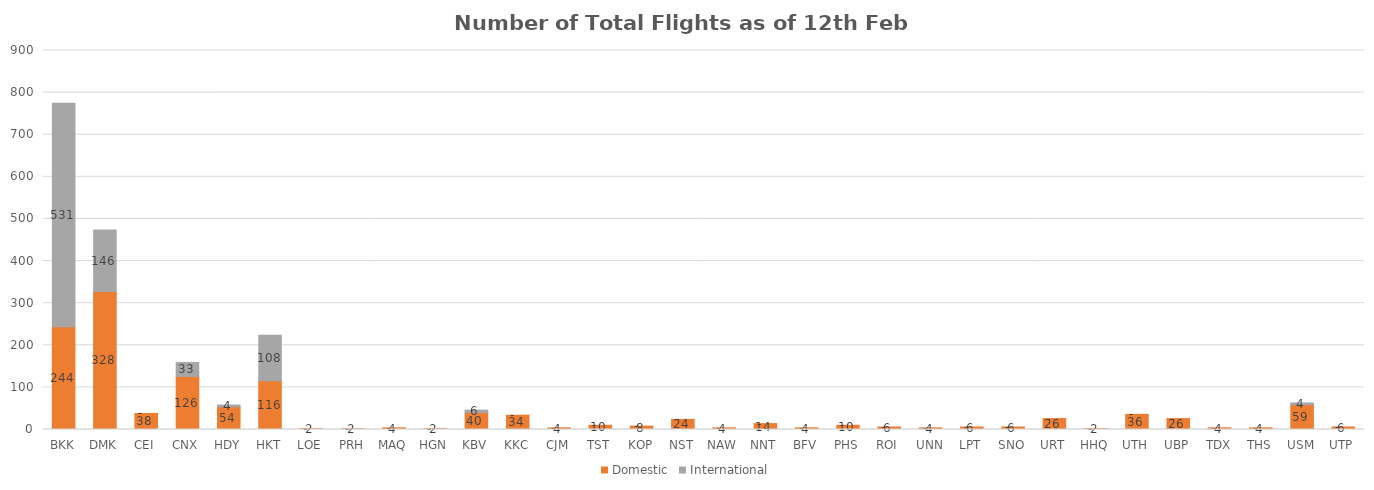
| Category | Domestic | International |
|---|---|---|
| BKK | 244 | 531 |
| DMK | 328 | 146 |
| CEI | 38 | 0 |
| CNX | 126 | 33 |
| HDY | 54 | 4 |
| HKT | 116 | 108 |
| LOE | 2 | 0 |
| PRH | 2 | 0 |
| MAQ | 4 | 0 |
| HGN | 2 | 0 |
| KBV | 40 | 6 |
| KKC | 34 | 0 |
| CJM | 4 | 0 |
| TST | 10 | 0 |
| KOP | 8 | 0 |
| NST | 24 | 0 |
| NAW | 4 | 0 |
| NNT | 14 | 0 |
| BFV | 4 | 0 |
| PHS | 10 | 0 |
| ROI | 6 | 0 |
| UNN | 4 | 0 |
| LPT | 6 | 0 |
| SNO | 6 | 0 |
| URT | 26 | 0 |
| HHQ | 2 | 0 |
| UTH | 36 | 0 |
| UBP | 26 | 0 |
| TDX | 4 | 0 |
| THS | 4 | 0 |
| USM | 59 | 4 |
| UTP | 6 | 0 |